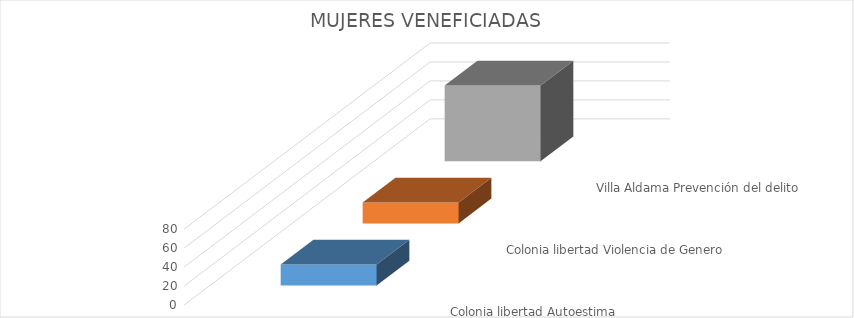
| Category | Colonia libertad | Villa Aldama |
|---|---|---|
| Mujeres veneficiadas | 22 | 80 |